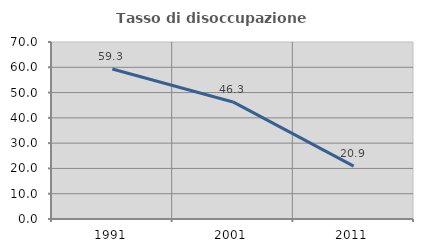
| Category | Tasso di disoccupazione giovanile  |
|---|---|
| 1991.0 | 59.341 |
| 2001.0 | 46.296 |
| 2011.0 | 20.93 |